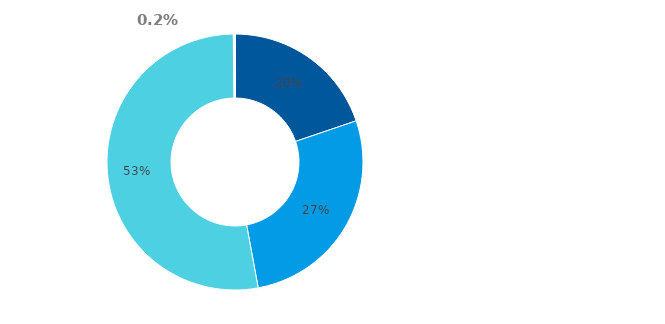
| Category | Series 3 |
|---|---|
| Hotovost | 0.198 |
| Půjčky poskytnuté nemovitostní společnosti | 0.273 |
| Majetkové účasti v nemovitostní společnosti | 0.527 |
| Ostatní finanční aktiva | 0.002 |